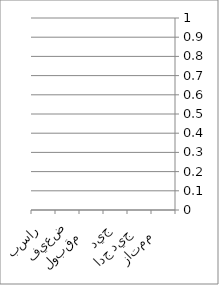
| Category | Series 0 |
|---|---|
| ممتاز   | 0 |
| جيد جدا  | 0 |
| جيد | 0 |
| مقبول   | 0 |
| ضعيف | 0 |
| راسب | 0 |